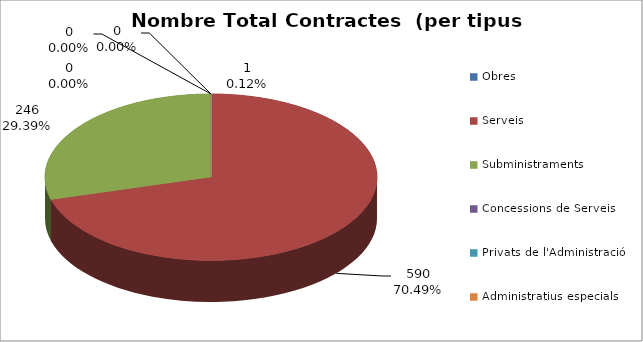
| Category | Nombre Total Contractes |
|---|---|
| Obres | 1 |
| Serveis | 590 |
| Subministraments | 246 |
| Concessions de Serveis | 0 |
| Privats de l'Administració | 0 |
| Administratius especials | 0 |